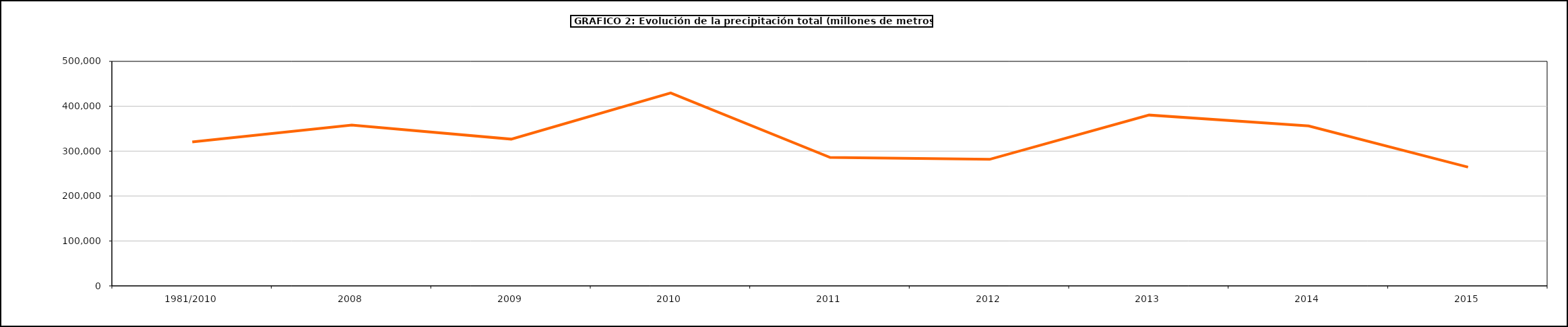
| Category | Series 0 |
|---|---|
| 1981/2010 | 320442 |
| 2008 | 358273.25 |
| 2009 | 326778 |
| 2010 | 429768 |
| 2011 | 285948 |
| 2012 | 281817 |
| 2013 | 380420 |
| 2014 | 356097 |
| 2015 | 264511.7 |